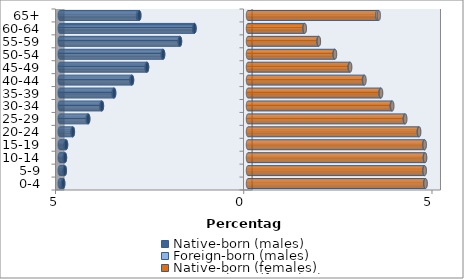
| Category | Native-born (males) | Foreign-born (males) | Native-born (females) | Foreign-born (females) |
|---|---|---|---|---|
| 0-4 | -4.909 | -0.008 | 4.71 | 0.007 |
| 5-9 | -4.867 | -0.007 | 4.687 | 0.006 |
| 10-14 | -4.862 | -0.007 | 4.698 | 0.007 |
| 15-19 | -4.833 | -0.009 | 4.685 | 0.008 |
| 20-24 | -4.652 | -0.012 | 4.538 | 0.01 |
| 25-29 | -4.244 | -0.015 | 4.166 | 0.012 |
| 30-34 | -3.88 | -0.016 | 3.819 | 0.014 |
| 35-39 | -3.556 | -0.016 | 3.521 | 0.015 |
| 40-44 | -3.081 | -0.015 | 3.08 | 0.014 |
| 45-49 | -2.682 | -0.013 | 2.702 | 0.012 |
| 50-54 | -2.255 | -0.01 | 2.301 | 0.01 |
| 55-59 | -1.807 | -0.008 | 1.874 | 0.009 |
| 60-64 | -1.422 | -0.007 | 1.501 | 0.007 |
| 65+ | -2.889 | -0.032 | 3.436 | 0.039 |